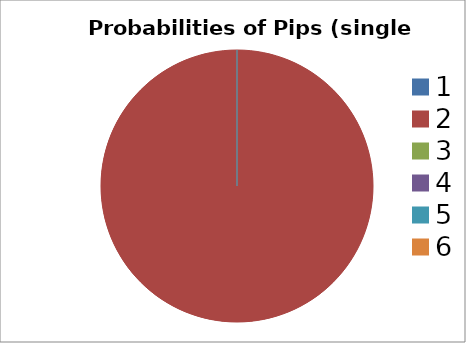
| Category | Series 0 |
|---|---|
| 0 | 0 |
| 1 | 1 |
| 2 | 0 |
| 3 | 0 |
| 4 | 0 |
| 5 | 0 |